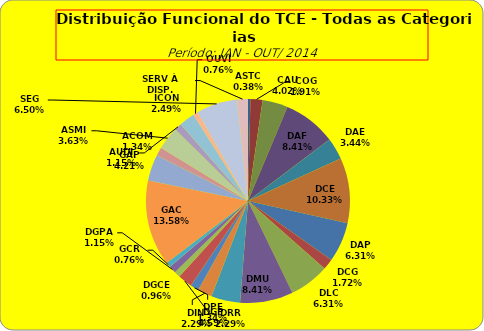
| Category | ASTC COG CAU DAF DAE DCE DAP DCG DLC DMU DGP DIN DPE DRR DGCE DGPA GCR GAC GAP ACOM ASMI AUDI ICON OUVI SEG SERV À DISP. |
|---|---|
| ASTC | 2 |
| COG | 10 |
| CAU | 21 |
| DAF | 44 |
| DAE | 18 |
| DCE | 54 |
| DAP | 33 |
| DCG | 9 |
| DLC | 33 |
| DMU | 44 |
| DGP | 24 |
| DIN | 12 |
| DPE | 7 |
| DRR | 12 |
| DGCE | 5 |
| DGPA | 6 |
| GCR | 4 |
| GAC | 71 |
| GAP | 22 |
| ACOM | 7 |
| ASMI | 19 |
| AUDI | 6 |
| ICON | 13 |
| OUVI | 4 |
| SEG | 34 |
| SERV À DISP. | 9 |